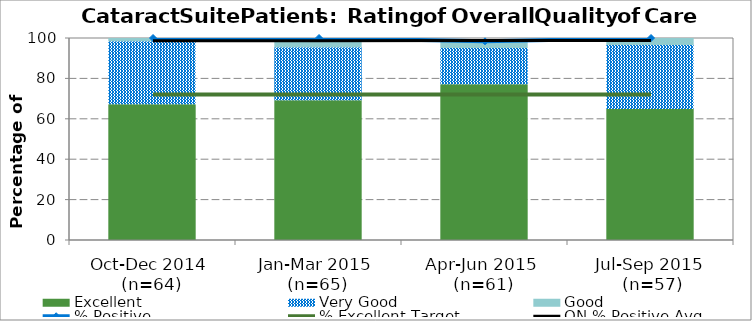
| Category | Excellent | Very Good | Good |
|---|---|---|---|
| Oct-Dec 2014 
(n=64) | 67.19 | 31.25 | 1.56 |
| Jan-Mar 2015 
(n=65) | 69.23 | 26.15 | 4.62 |
| Apr-Jun 2015 
(n=61)
   | 77.05 | 18.03 | 3.28 |
| Jul-Sep 2015
 (n=57) | 64.9 | 31.6 | 3.51 |